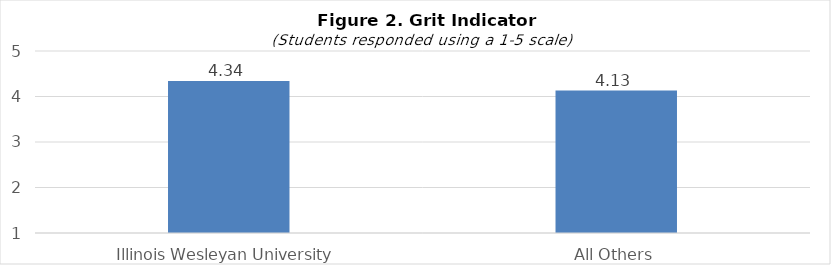
| Category | Series 0 |
|---|---|
| Illinois Wesleyan University | 4.34 |
| All Others | 4.13 |